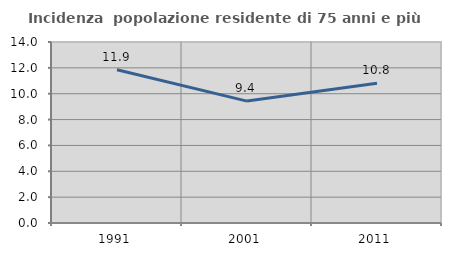
| Category | Incidenza  popolazione residente di 75 anni e più |
|---|---|
| 1991.0 | 11.857 |
| 2001.0 | 9.428 |
| 2011.0 | 10.809 |